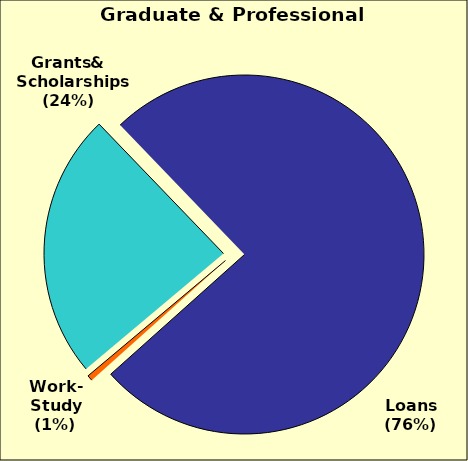
| Category | Series 0 |
|---|---|
| 0 | 0.239 |
| 1 | 0.756 |
| 2 | 0.005 |